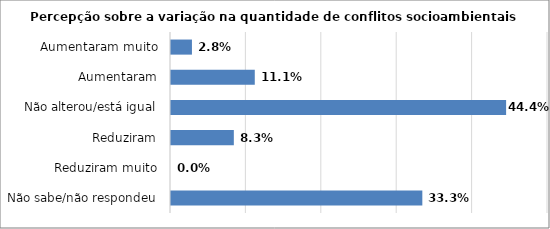
| Category | Series 0 |
|---|---|
| Não sabe/não respondeu | 0.333 |
| Reduziram muito | 0 |
| Reduziram | 0.083 |
| Não alterou/está igual | 0.444 |
| Aumentaram | 0.111 |
| Aumentaram muito | 0.028 |